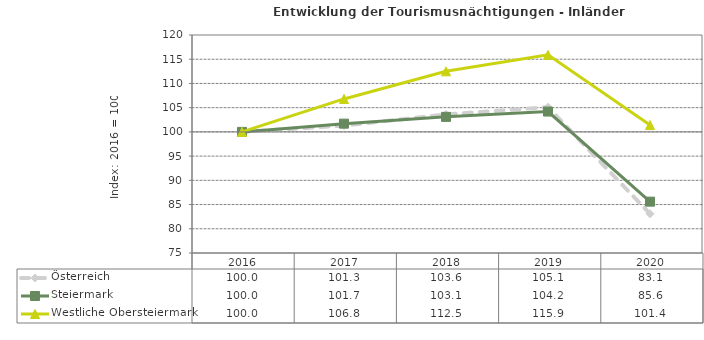
| Category | Österreich | Steiermark | Westliche Obersteiermark |
|---|---|---|---|
| 2020.0 | 83.1 | 85.6 | 101.4 |
| 2019.0 | 105.1 | 104.2 | 115.9 |
| 2018.0 | 103.6 | 103.1 | 112.5 |
| 2017.0 | 101.3 | 101.7 | 106.8 |
| 2016.0 | 100 | 100 | 100 |